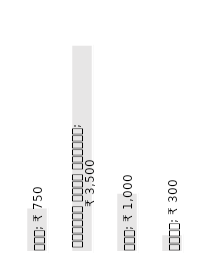
| Category | वार्षिक आय |
|---|---|
| देय | 750 |
| अनुदान संचय समारोह | 3500 |
| दान | 1000 |
| अन्य | 300 |